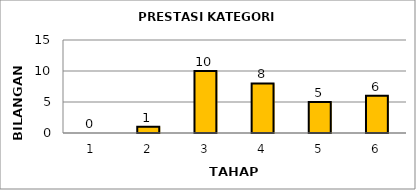
| Category | Series 0 |
|---|---|
| 1.0 | 0 |
| 2.0 | 1 |
| 3.0 | 10 |
| 4.0 | 8 |
| 5.0 | 5 |
| 6.0 | 6 |